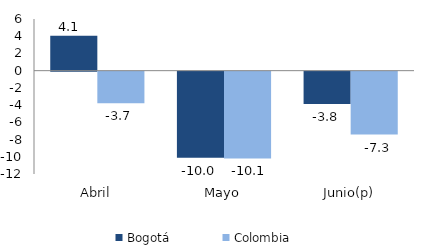
| Category | Bogotá | Colombia |
|---|---|---|
| Abril | 4.061 | -3.655 |
| Mayo | -9.988 | -10.077 |
| Junio(p) | -3.754 | -7.306 |